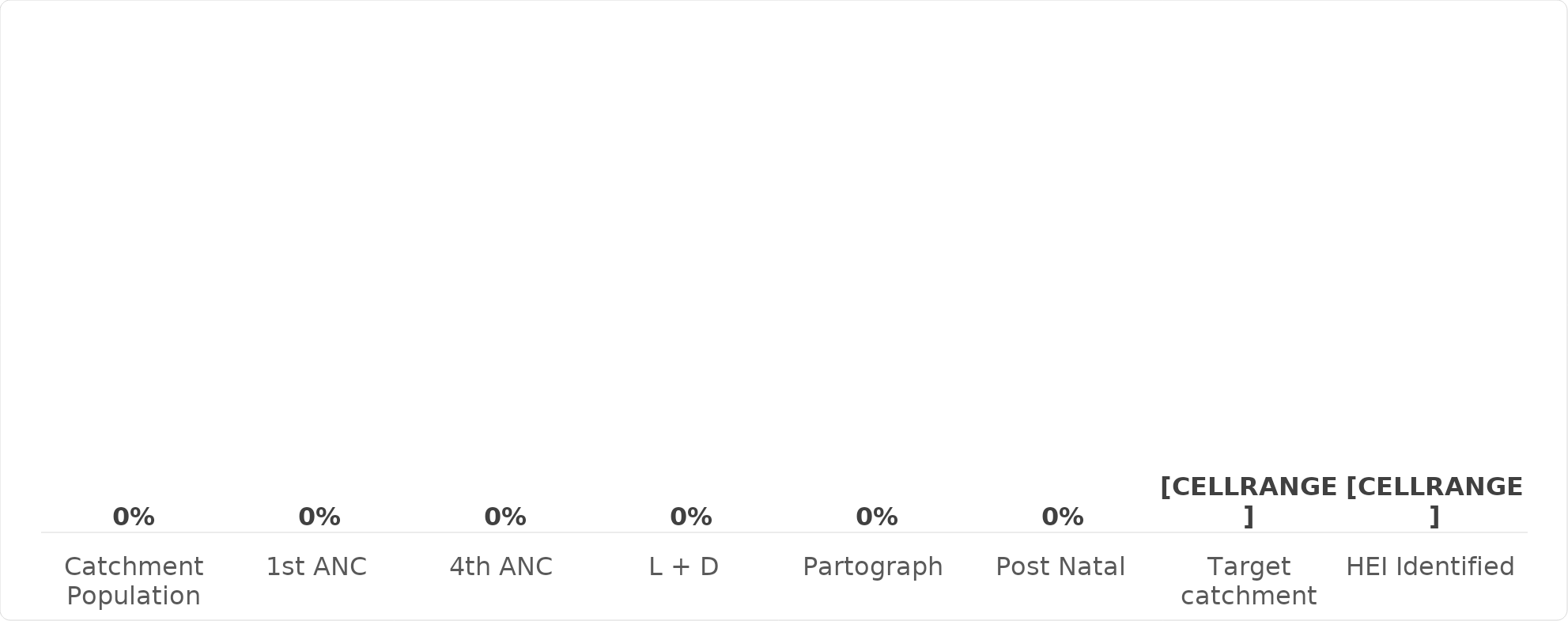
| Category | Total |
|---|---|
| Catchment Population | 0 |
| 1st ANC | 0 |
| 4th ANC | 0 |
| L + D  | 0 |
| Partograph | 0 |
| Post Natal | 0 |
| Target catchment | 0 |
| HEI Identified | 0 |